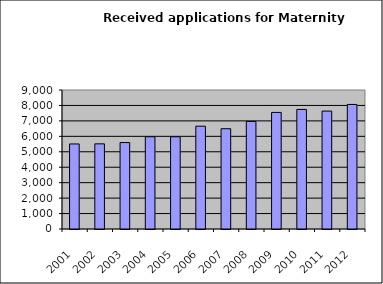
| Category | Series 1 |
|---|---|
| 2001.0 | 5507 |
| 2002.0 | 5513 |
| 2003.0 | 5597 |
| 2004.0 | 5974 |
| 2005.0 | 5970 |
| 2006.0 | 6656 |
| 2007.0 | 6494 |
| 2008.0 | 6966 |
| 2009.0 | 7549 |
| 2010.0 | 7742 |
| 2011.0 | 7635 |
| 2012.0 | 8065 |